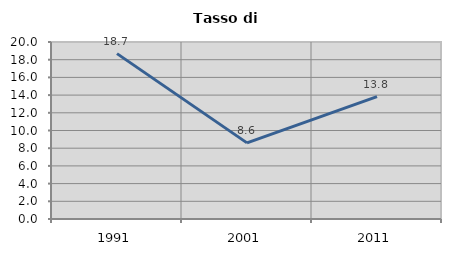
| Category | Tasso di disoccupazione   |
|---|---|
| 1991.0 | 18.687 |
| 2001.0 | 8.602 |
| 2011.0 | 13.83 |